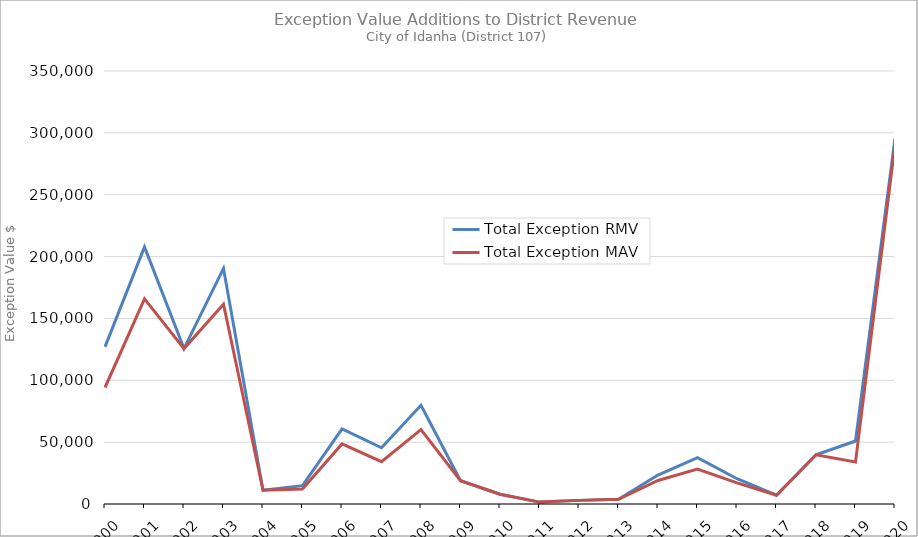
| Category | Total Exception RMV | Total Exception MAV |
|---|---|---|
| 2000.0 | 127017 | 94127 |
| 2001.0 | 207799 | 165829 |
| 2002.0 | 125604 | 125604 |
| 2003.0 | 190440 | 161430 |
| 2004.0 | 11143 | 11143 |
| 2005.0 | 14813 | 12103 |
| 2006.0 | 60741 | 48551 |
| 2007.0 | 45464 | 34194 |
| 2008.0 | 79778 | 60148 |
| 2009.0 | 18777 | 18777 |
| 2010.0 | 7853 | 7853 |
| 2011.0 | 1527 | 1527 |
| 2012.0 | 2930 | 2930 |
| 2013.0 | 3773 | 3773 |
| 2014.0 | 23424 | 19044 |
| 2015.0 | 37450 | 28230 |
| 2016.0 | 20444 | 17114 |
| 2017.0 | 7121 | 7121 |
| 2018.0 | 39807 | 39807 |
| 2019.0 | 50906 | 33896 |
| 2020.0 | 295577 | 290697 |